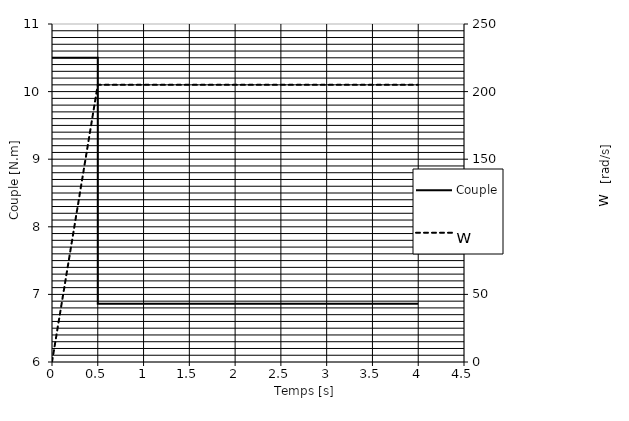
| Category | Couple |
|---|---|
| 0.0 | 10.5 |
| 0.5 | 10.5 |
| 0.5 | 6.86 |
| 4.0 | 6.86 |